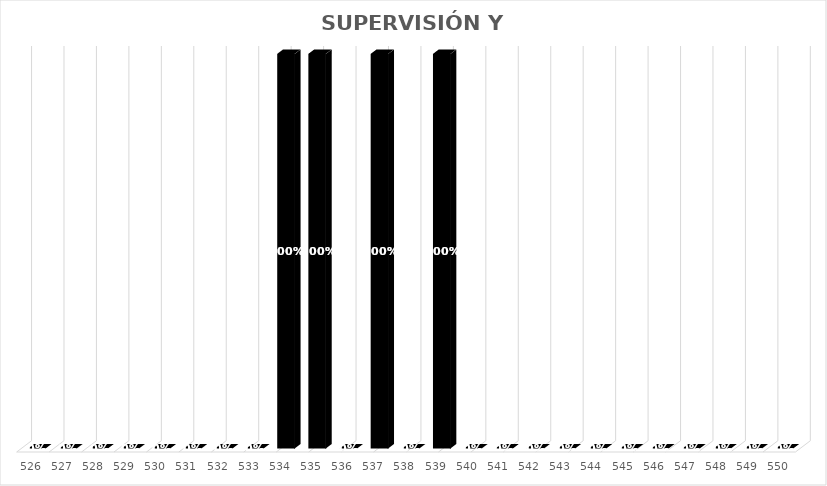
| Category | % Avance |
|---|---|
| 526.0 | 0 |
| 527.0 | 0 |
| 528.0 | 0 |
| 529.0 | 0 |
| 530.0 | 0 |
| 531.0 | 0 |
| 532.0 | 0 |
| 533.0 | 0 |
| 534.0 | 1 |
| 535.0 | 1 |
| 536.0 | 0 |
| 537.0 | 1 |
| 538.0 | 0 |
| 539.0 | 1 |
| 540.0 | 0 |
| 541.0 | 0 |
| 542.0 | 0 |
| 543.0 | 0 |
| 544.0 | 0 |
| 545.0 | 0 |
| 546.0 | 0 |
| 547.0 | 0 |
| 548.0 | 0 |
| 549.0 | 0 |
| 550.0 | 0 |